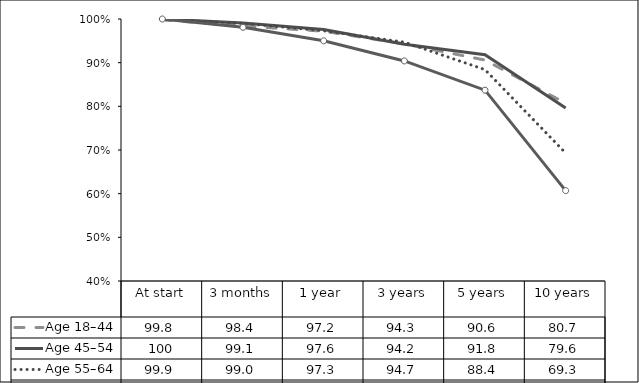
| Category | Age 18–44  | Age 45–54  | Age 55–64  | Age 65+  |
|---|---|---|---|---|
| At start | 99.8 | 100 | 99.9 | 100 |
| 3 months | 98.4 | 99.1 | 99 | 98.1 |
| 1 year | 97.2 | 97.6 | 97.3 | 95 |
| 3 years | 94.3 | 94.2 | 94.7 | 90.4 |
| 5 years | 90.6 | 91.8 | 88.4 | 83.7 |
| 10 years | 80.7 | 79.6 | 69.3 | 60.7 |